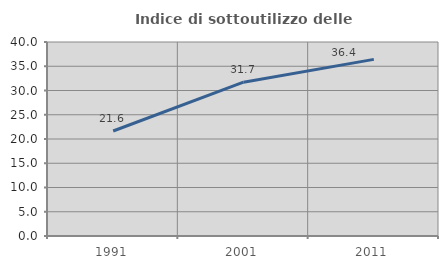
| Category | Indice di sottoutilizzo delle abitazioni  |
|---|---|
| 1991.0 | 21.645 |
| 2001.0 | 31.716 |
| 2011.0 | 36.422 |